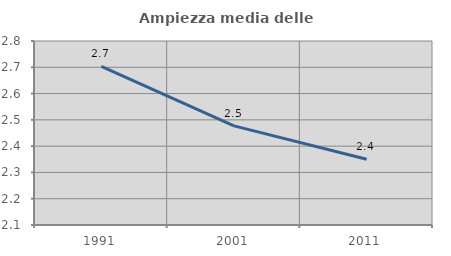
| Category | Ampiezza media delle famiglie |
|---|---|
| 1991.0 | 2.703 |
| 2001.0 | 2.477 |
| 2011.0 | 2.35 |